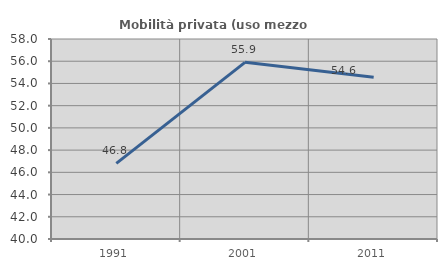
| Category | Mobilità privata (uso mezzo privato) |
|---|---|
| 1991.0 | 46.811 |
| 2001.0 | 55.902 |
| 2011.0 | 54.563 |